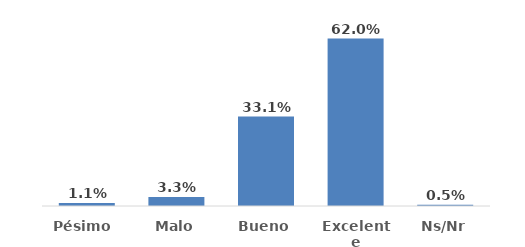
| Category | Series 0 |
|---|---|
| Pésimo  | 0.011 |
| Malo | 0.033 |
| Bueno | 0.331 |
| Excelente | 0.62 |
| Ns/Nr | 0.005 |